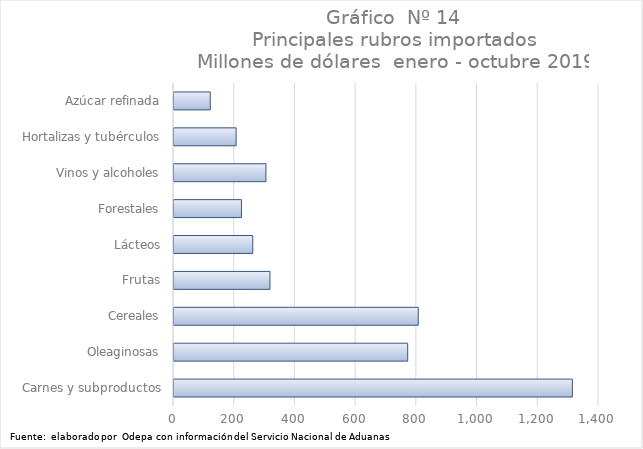
| Category | Series 0 |
|---|---|
| Carnes y subproductos | 1312252.618 |
| Oleaginosas | 769833.079 |
| Cereales | 804576.369 |
| Frutas | 316153.828 |
| Lácteos | 259434.287 |
| Forestales | 222098 |
| Vinos y alcoholes | 302810.017 |
| Hortalizas y tubérculos | 204661.038 |
| Azúcar refinada | 119488.86 |